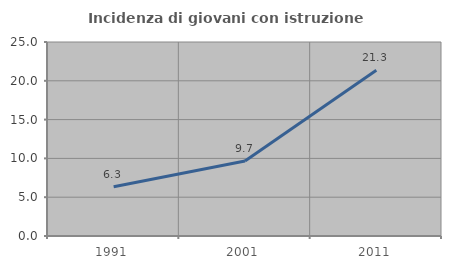
| Category | Incidenza di giovani con istruzione universitaria |
|---|---|
| 1991.0 | 6.349 |
| 2001.0 | 9.655 |
| 2011.0 | 21.348 |